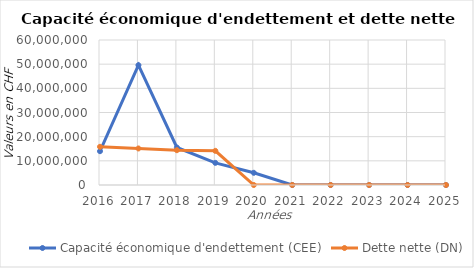
| Category | Capacité économique d'endettement (CEE) | Dette nette (DN) |
|---|---|---|
| 2016.0 | 13992900 | 15805267.5 |
| 2017.0 | 49577376.6 | 15118637.91 |
| 2018.0 | 15514917 | 14405548.13 |
| 2019.0 | 9160666.2 | 14132261.5 |
| 2020.0 | 5044950 | 0 |
| 2021.0 | 0 | 0 |
| 2022.0 | 0 | 0 |
| 2023.0 | 0 | 0 |
| 2024.0 | 0 | 0 |
| 2025.0 | 0 | 0 |